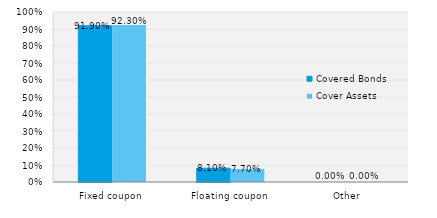
| Category | Covered Bonds | Cover Assets |
|---|---|---|
| Fixed coupon | 0.919 | 0.923 |
| Floating coupon | 0.081 | 0.077 |
| Other | 0 | 0 |